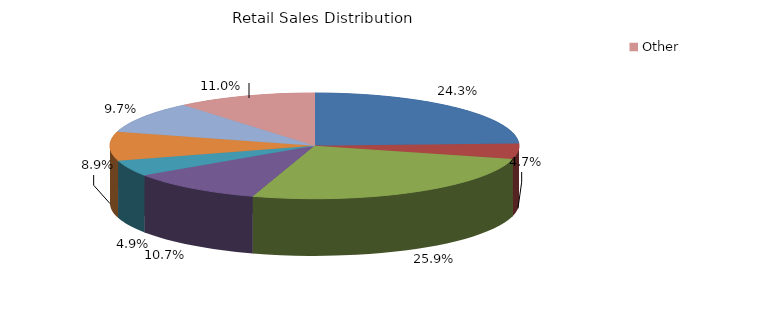
| Category | Series 0 |
|---|---|
| Food | 0.243 |
| Apparel | 0.047 |
| Gen.Merch. | 0.259 |
| Auto | 0.107 |
| Furniture | 0.049 |
| Build Materials | 0.089 |
| Service | 0.097 |
| Other | 0.11 |